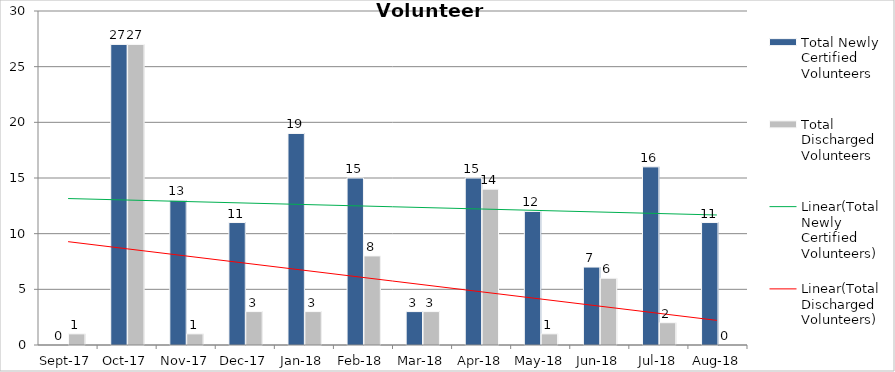
| Category | Total Newly Certified Volunteers | Total Discharged Volunteers |
|---|---|---|
| 2017-09-01 | 0 | 1 |
| 2017-10-01 | 27 | 27 |
| 2017-11-01 | 13 | 1 |
| 2017-12-01 | 11 | 3 |
| 2018-01-01 | 19 | 3 |
| 2018-02-01 | 15 | 8 |
| 2018-03-01 | 3 | 3 |
| 2018-04-01 | 15 | 14 |
| 2018-05-01 | 12 | 1 |
| 2018-06-01 | 7 | 6 |
| 2018-07-01 | 16 | 2 |
| 2018-08-01 | 11 | 0 |